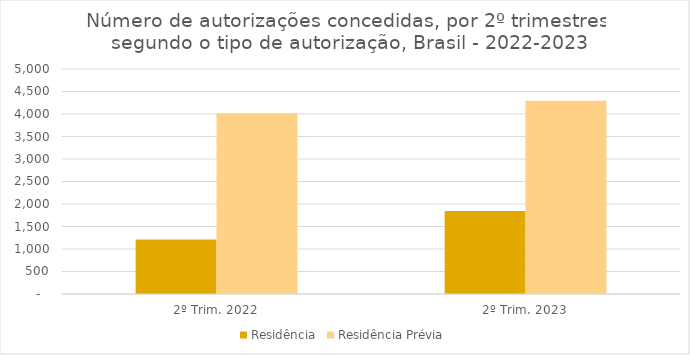
| Category | Residência | Residência Prévia |
|---|---|---|
| 2º Trim. 2022 | 1213 | 4019 |
| 2º Trim. 2023 | 1845 | 4294 |